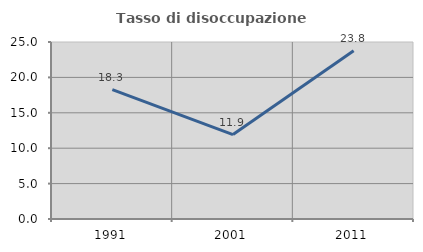
| Category | Tasso di disoccupazione giovanile  |
|---|---|
| 1991.0 | 18.274 |
| 2001.0 | 11.927 |
| 2011.0 | 23.75 |